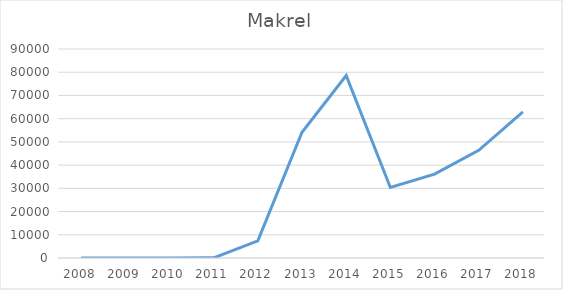
| Category | Series 0 |
|---|---|
| 2008.0 | 0 |
| 2009.0 | 0 |
| 2010.0 | 0 |
| 2011.0 | 62 |
| 2012.0 | 7402 |
| 2013.0 | 54148 |
| 2014.0 | 78581 |
| 2015.0 | 30351 |
| 2016.0 | 36142 |
| 2017.0 | 46388 |
| 2018.0 | 62973 |